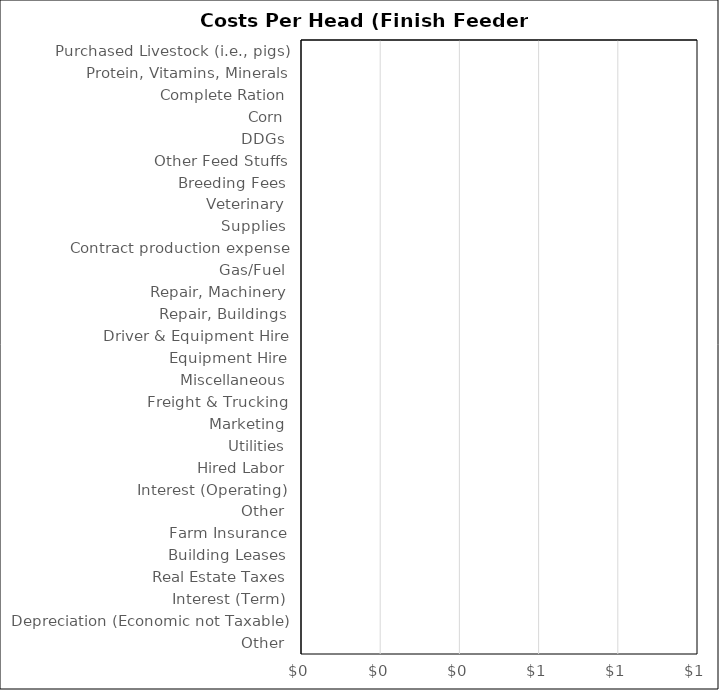
| Category | Beef Backgrounding |
|---|---|
| Purchased Livestock (i.e., pigs) | 0 |
| Protein, Vitamins, Minerals | 0 |
| Complete Ration | 0 |
| Corn | 0 |
| DDGs | 0 |
| Other Feed Stuffs | 0 |
| Breeding Fees | 0 |
| Veterinary | 0 |
| Supplies | 0 |
| Contract production expense | 0 |
| Gas/Fuel | 0 |
| Repair, Machinery | 0 |
| Repair, Buildings | 0 |
| Driver & Equipment Hire | 0 |
| Equipment Hire | 0 |
| Miscellaneous | 0 |
| Freight & Trucking | 0 |
| Marketing | 0 |
| Utilities | 0 |
| Hired Labor | 0 |
| Interest (Operating) | 0 |
| Other | 0 |
| Farm Insurance | 0 |
| Building Leases | 0 |
| Real Estate Taxes | 0 |
| Interest (Term) | 0 |
| Depreciation (Economic not Taxable) | 0 |
| Other | 0 |